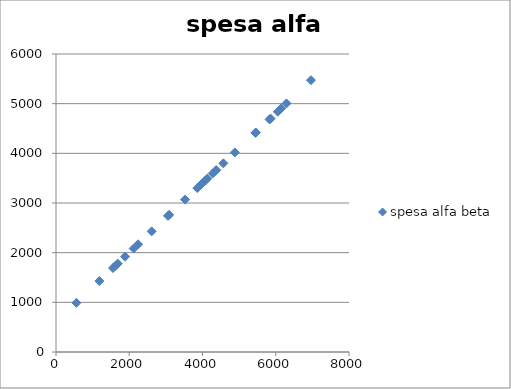
| Category | spesa alfa beta |
|---|---|
| 3089.0 | 2762.3 |
| 4128.0 | 3489.6 |
| 4357.0 | 3649.9 |
| 6961.0 | 5472.7 |
| 4074.0 | 3451.8 |
| 4375.0 | 3662.5 |
| 5832.0 | 4682.4 |
| 1886.0 | 1920.2 |
| 4883.0 | 4018.1 |
| 2120.0 | 2084 |
| 5445.0 | 4411.5 |
| 1685.0 | 1779.5 |
| 6151.0 | 4905.7 |
| 3058.0 | 2740.6 |
| 2613.0 | 2429.1 |
| 6055.0 | 4838.5 |
| 3526.0 | 3068.2 |
| 3959.0 | 3371.3 |
| 2241.0 | 2168.7 |
| 1557.0 | 1689.9 |
| 4277.0 | 3593.9 |
| 557.0 | 989.9 |
| 3858.0 | 3300.6 |
| 1625.0 | 1737.5 |
| 6293.0 | 5005.1 |
| 4570.0 | 3799 |
| 5457.0 | 4419.9 |
| 5858.0 | 4700.6 |
| 1184.0 | 1428.8 |
| 3973.0 | 3381.1 |